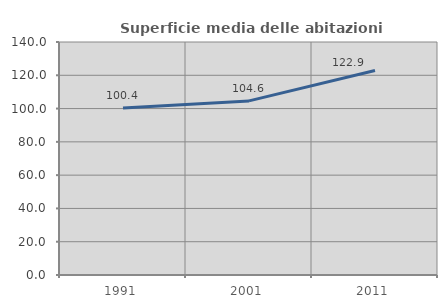
| Category | Superficie media delle abitazioni occupate |
|---|---|
| 1991.0 | 100.386 |
| 2001.0 | 104.603 |
| 2011.0 | 122.853 |